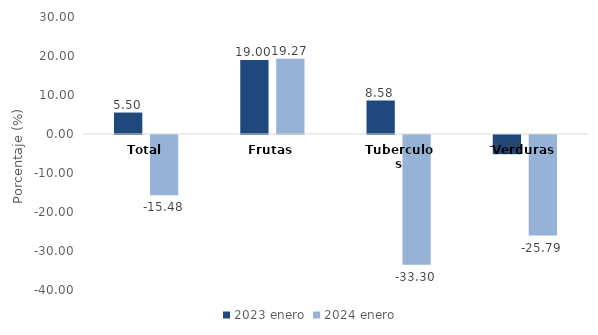
| Category | 2023 | 2024 |
|---|---|---|
| Total | 5.503 | -15.479 |
| Frutas | 18.999 | 19.27 |
| Tuberculos | 8.58 | -33.296 |
| Verduras | -4.92 | -25.792 |